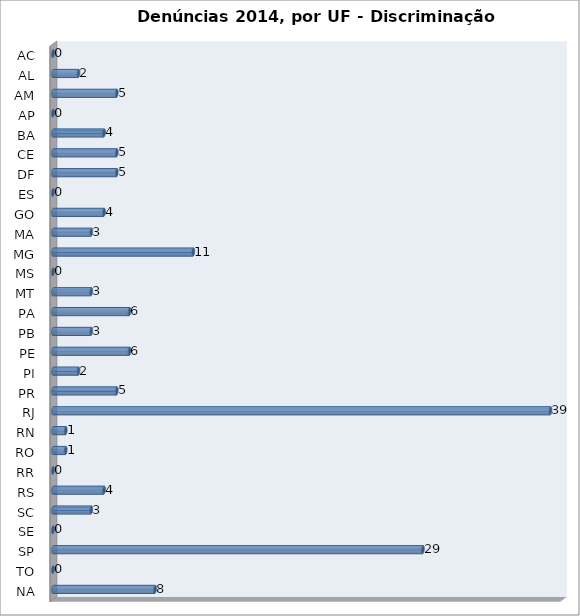
| Category | Series 0 |
|---|---|
| AC | 0 |
| AL | 2 |
| AM | 5 |
| AP | 0 |
| BA | 4 |
| CE | 5 |
| DF | 5 |
| ES | 0 |
| GO | 4 |
| MA | 3 |
| MG | 11 |
| MS | 0 |
| MT | 3 |
| PA | 6 |
| PB | 3 |
| PE | 6 |
| PI | 2 |
| PR | 5 |
| RJ | 39 |
| RN | 1 |
| RO | 1 |
| RR | 0 |
| RS | 4 |
| SC | 3 |
| SE | 0 |
| SP | 29 |
| TO | 0 |
| NA | 8 |